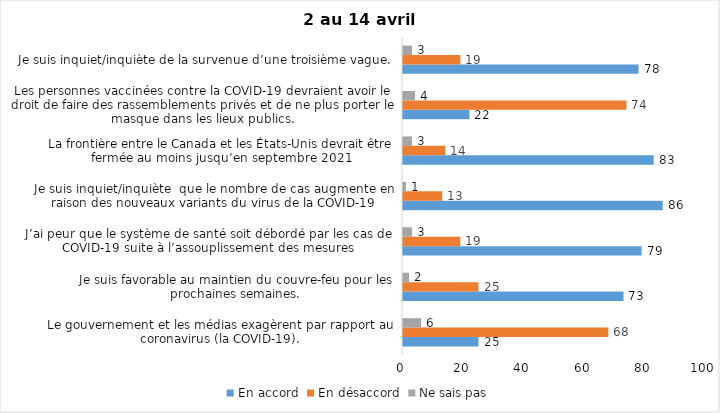
| Category | En accord | En désaccord | Ne sais pas |
|---|---|---|---|
| Le gouvernement et les médias exagèrent par rapport au coronavirus (la COVID-19). | 25 | 68 | 6 |
| Je suis favorable au maintien du couvre-feu pour les prochaines semaines. | 73 | 25 | 2 |
| J’ai peur que le système de santé soit débordé par les cas de COVID-19 suite à l’assouplissement des mesures | 79 | 19 | 3 |
| Je suis inquiet/inquiète  que le nombre de cas augmente en raison des nouveaux variants du virus de la COVID-19 | 86 | 13 | 1 |
| La frontière entre le Canada et les États-Unis devrait être fermée au moins jusqu’en septembre 2021 | 83 | 14 | 3 |
| Les personnes vaccinées contre la COVID-19 devraient avoir le droit de faire des rassemblements privés et de ne plus porter le masque dans les lieux publics. | 22 | 74 | 4 |
| Je suis inquiet/inquiète de la survenue d’une troisième vague. | 78 | 19 | 3 |